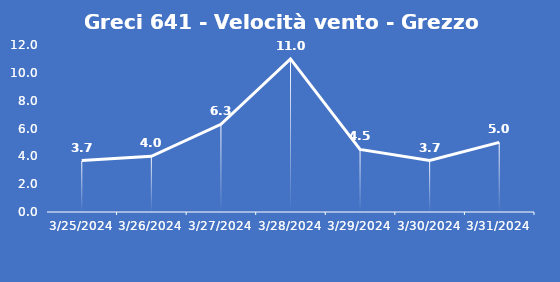
| Category | Greci 641 - Velocità vento - Grezzo (m/s) |
|---|---|
| 3/25/24 | 3.7 |
| 3/26/24 | 4 |
| 3/27/24 | 6.3 |
| 3/28/24 | 11 |
| 3/29/24 | 4.5 |
| 3/30/24 | 3.7 |
| 3/31/24 | 5 |